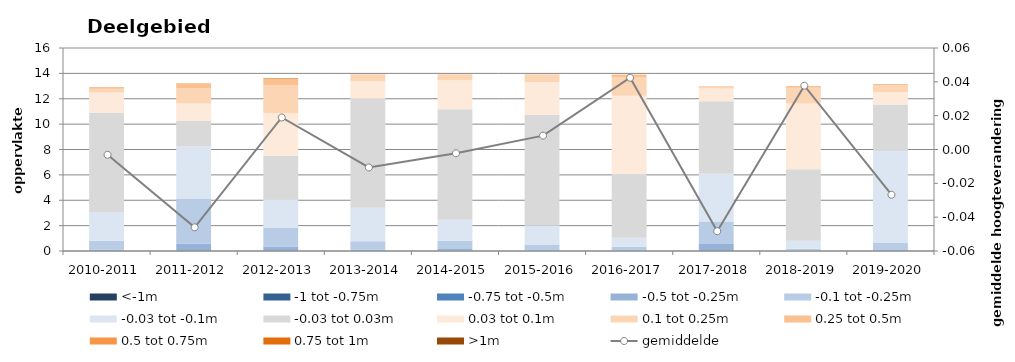
| Category | <-1m | -1 tot -0.75m | -0.75 tot -0.5m | -0.5 tot -0.25m | -0.1 tot -0.25m | -0.03 tot -0.1m | -0.03 tot 0.03m | 0.03 tot 0.1m | 0.1 tot 0.25m | 0.25 tot 0.5m | 0.5 tot 0.75m | 0.75 tot 1m | >1m |
|---|---|---|---|---|---|---|---|---|---|---|---|---|---|
| 2010-2011 | 0 | 0.001 | 0.008 | 0.116 | 0.69 | 2.261 | 7.802 | 1.607 | 0.311 | 0.081 | 0.018 | 0.004 | 0.002 |
| 2011-2012 | 0 | 0.003 | 0.03 | 0.56 | 3.544 | 4.097 | 2.004 | 1.39 | 1.202 | 0.343 | 0.025 | 0.002 | 0 |
| 2012-2013 | 0.006 | 0.009 | 0.03 | 0.306 | 1.494 | 2.186 | 3.483 | 3.364 | 2.171 | 0.496 | 0.049 | 0.011 | 0.004 |
| 2013-2014 | 0 | 0.001 | 0.007 | 0.112 | 0.648 | 2.638 | 8.601 | 1.367 | 0.461 | 0.073 | 0.006 | 0.002 | 0 |
| 2014-2015 | 0.001 | 0.004 | 0.014 | 0.142 | 0.647 | 1.649 | 8.718 | 2.285 | 0.414 | 0.04 | 0.003 | 0 | 0 |
| 2015-2016 | 0.001 | 0.002 | 0.005 | 0.05 | 0.458 | 1.498 | 8.719 | 2.596 | 0.52 | 0.061 | 0.005 | 0.001 | 0 |
| 2016-2017 | 0 | 0 | 0.005 | 0.046 | 0.293 | 0.7 | 5.041 | 6.143 | 1.49 | 0.186 | 0.009 | 0.002 | 0 |
| 2017-2018 | 0.001 | 0.006 | 0.041 | 0.503 | 1.765 | 3.772 | 5.711 | 1.011 | 0.162 | 0.024 | 0.004 | 0 | 0 |
| 2018-2019 | 0 | 0 | 0.001 | 0.017 | 0.164 | 0.629 | 5.628 | 5.184 | 1.24 | 0.133 | 0.004 | 0 | 0 |
| 2019-2020 | 0 | 0 | 0.004 | 0.066 | 0.599 | 7.218 | 3.668 | 0.965 | 0.541 | 0.099 | 0.006 | 0.001 | 0.001 |